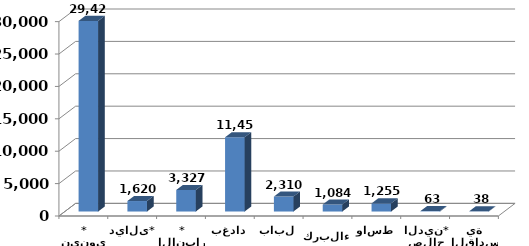
| Category | المساحة المزروعة  (دونم) |
|---|---|
| نينوى* | 29425 |
| ديالى* | 1620 |
| الانبار* | 3327 |
| بغداد | 11458 |
| بابل | 2310 |
| كربلاء | 1084 |
| واسط | 1255 |
| صلاح الدين* | 63 |
| القادسية | 38 |